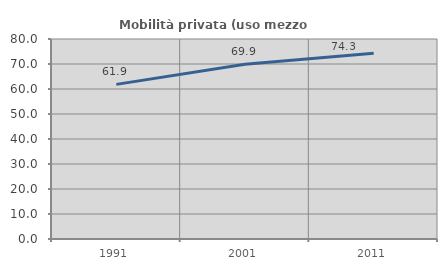
| Category | Mobilità privata (uso mezzo privato) |
|---|---|
| 1991.0 | 61.851 |
| 2001.0 | 69.891 |
| 2011.0 | 74.259 |